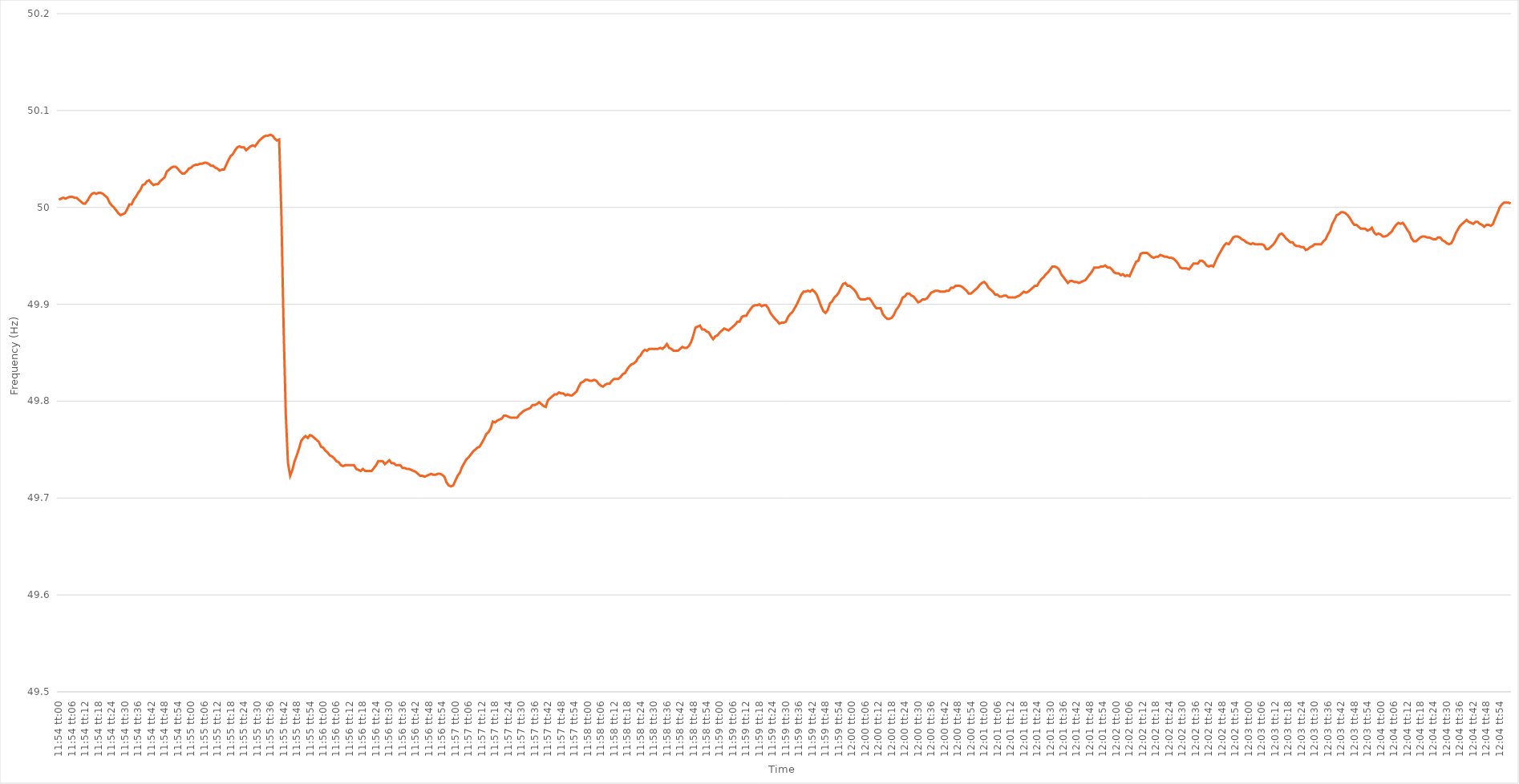
| Category | Series 0 |
|---|---|
| 0.49583333333333335 | 50.008 |
| 0.4958449074074074 | 50.009 |
| 0.4958564814814815 | 50.01 |
| 0.4958680555555555 | 50.009 |
| 0.49587962962962967 | 50.01 |
| 0.4958912037037037 | 50.011 |
| 0.4959027777777778 | 50.011 |
| 0.49591435185185184 | 50.01 |
| 0.49592592592592594 | 50.01 |
| 0.4959375 | 50.008 |
| 0.4959490740740741 | 50.006 |
| 0.49596064814814816 | 50.004 |
| 0.49597222222222226 | 50.004 |
| 0.4959837962962963 | 50.007 |
| 0.49599537037037034 | 50.011 |
| 0.49600694444444443 | 50.014 |
| 0.49601851851851847 | 50.015 |
| 0.4960300925925926 | 50.014 |
| 0.49604166666666666 | 50.015 |
| 0.49605324074074075 | 50.015 |
| 0.4960648148148148 | 50.014 |
| 0.4960763888888889 | 50.012 |
| 0.4960879629629629 | 50.01 |
| 0.4960995370370371 | 50.005 |
| 0.4961111111111111 | 50.002 |
| 0.4961226851851852 | 50 |
| 0.49613425925925925 | 49.997 |
| 0.49614583333333334 | 49.994 |
| 0.4961574074074074 | 49.992 |
| 0.49616898148148153 | 49.993 |
| 0.49618055555555557 | 49.994 |
| 0.49619212962962966 | 49.998 |
| 0.4962037037037037 | 50.003 |
| 0.49621527777777774 | 50.003 |
| 0.49622685185185184 | 50.008 |
| 0.4962384259259259 | 50.011 |
| 0.49625 | 50.015 |
| 0.49626157407407406 | 50.018 |
| 0.49627314814814816 | 50.023 |
| 0.4962847222222222 | 50.024 |
| 0.4962962962962963 | 50.027 |
| 0.49630787037037033 | 50.028 |
| 0.4963194444444445 | 50.025 |
| 0.4963310185185185 | 50.023 |
| 0.4963425925925926 | 50.024 |
| 0.49635416666666665 | 50.024 |
| 0.49636574074074075 | 50.027 |
| 0.4963773148148148 | 50.029 |
| 0.49638888888888894 | 50.031 |
| 0.496400462962963 | 50.037 |
| 0.49641203703703707 | 50.039 |
| 0.4964236111111111 | 50.041 |
| 0.4964351851851852 | 50.042 |
| 0.49644675925925924 | 50.042 |
| 0.4964583333333333 | 50.04 |
| 0.49646990740740743 | 50.037 |
| 0.49648148148148147 | 50.035 |
| 0.49649305555555556 | 50.035 |
| 0.4965046296296296 | 50.037 |
| 0.4965162037037037 | 50.04 |
| 0.49652777777777773 | 50.041 |
| 0.4965393518518519 | 50.043 |
| 0.4965509259259259 | 50.044 |
| 0.4965625 | 50.044 |
| 0.49657407407407406 | 50.045 |
| 0.49658564814814815 | 50.045 |
| 0.4965972222222222 | 50.046 |
| 0.49660879629629634 | 50.046 |
| 0.4966203703703704 | 50.045 |
| 0.4966319444444445 | 50.043 |
| 0.4966435185185185 | 50.043 |
| 0.4966550925925926 | 50.041 |
| 0.49666666666666665 | 50.04 |
| 0.4966782407407408 | 50.038 |
| 0.49668981481481483 | 50.039 |
| 0.4967013888888889 | 50.039 |
| 0.49671296296296297 | 50.044 |
| 0.496724537037037 | 50.049 |
| 0.4967361111111111 | 50.053 |
| 0.49674768518518514 | 50.055 |
| 0.4967592592592593 | 50.059 |
| 0.49677083333333333 | 50.062 |
| 0.4967824074074074 | 50.063 |
| 0.49679398148148146 | 50.062 |
| 0.49680555555555556 | 50.062 |
| 0.4968171296296296 | 50.059 |
| 0.49682870370370374 | 50.061 |
| 0.4968402777777778 | 50.063 |
| 0.4968518518518519 | 50.064 |
| 0.4968634259259259 | 50.063 |
| 0.496875 | 50.066 |
| 0.49688657407407405 | 50.069 |
| 0.4968981481481482 | 50.071 |
| 0.49690972222222224 | 50.073 |
| 0.49692129629629633 | 50.074 |
| 0.49693287037037037 | 50.074 |
| 0.4969444444444444 | 50.075 |
| 0.4969560185185185 | 50.074 |
| 0.49696759259259254 | 50.071 |
| 0.4969791666666667 | 50.069 |
| 0.49699074074074073 | 50.07 |
| 0.4970023148148148 | 49.994 |
| 0.49701388888888887 | 49.878 |
| 0.49702546296296296 | 49.787 |
| 0.497037037037037 | 49.736 |
| 0.49704861111111115 | 49.723 |
| 0.4970601851851852 | 49.729 |
| 0.4970717592592593 | 49.738 |
| 0.4970833333333333 | 49.744 |
| 0.4970949074074074 | 49.751 |
| 0.49710648148148145 | 49.759 |
| 0.4971180555555556 | 49.762 |
| 0.49712962962962964 | 49.764 |
| 0.49714120370370374 | 49.762 |
| 0.4971527777777778 | 49.765 |
| 0.4971643518518518 | 49.764 |
| 0.4971759259259259 | 49.762 |
| 0.49718749999999995 | 49.76 |
| 0.4971990740740741 | 49.758 |
| 0.49721064814814814 | 49.753 |
| 0.49722222222222223 | 49.752 |
| 0.49723379629629627 | 49.749 |
| 0.49724537037037037 | 49.747 |
| 0.4972569444444444 | 49.744 |
| 0.49726851851851855 | 49.743 |
| 0.4972800925925926 | 49.741 |
| 0.4972916666666667 | 49.738 |
| 0.4973032407407407 | 49.737 |
| 0.4973148148148148 | 49.734 |
| 0.49732638888888886 | 49.733 |
| 0.497337962962963 | 49.734 |
| 0.49734953703703705 | 49.734 |
| 0.49736111111111114 | 49.734 |
| 0.4973726851851852 | 49.734 |
| 0.4973842592592593 | 49.734 |
| 0.4973958333333333 | 49.73 |
| 0.49740740740740735 | 49.729 |
| 0.4974189814814815 | 49.728 |
| 0.49743055555555554 | 49.73 |
| 0.49744212962962964 | 49.728 |
| 0.4974537037037037 | 49.728 |
| 0.49746527777777777 | 49.728 |
| 0.4974768518518518 | 49.728 |
| 0.49748842592592596 | 49.731 |
| 0.4975 | 49.734 |
| 0.4975115740740741 | 49.738 |
| 0.49752314814814813 | 49.738 |
| 0.4975347222222222 | 49.738 |
| 0.49754629629629626 | 49.735 |
| 0.4975578703703704 | 49.737 |
| 0.49756944444444445 | 49.739 |
| 0.49758101851851855 | 49.736 |
| 0.4975925925925926 | 49.736 |
| 0.4976041666666667 | 49.734 |
| 0.4976157407407407 | 49.734 |
| 0.49762731481481487 | 49.734 |
| 0.4976388888888889 | 49.731 |
| 0.49765046296296295 | 49.731 |
| 0.49766203703703704 | 49.73 |
| 0.4976736111111111 | 49.73 |
| 0.4976851851851852 | 49.729 |
| 0.4976967592592592 | 49.728 |
| 0.49770833333333336 | 49.727 |
| 0.4977199074074074 | 49.725 |
| 0.4977314814814815 | 49.723 |
| 0.49774305555555554 | 49.723 |
| 0.49775462962962963 | 49.722 |
| 0.49776620370370367 | 49.723 |
| 0.4977777777777778 | 49.724 |
| 0.49778935185185186 | 49.725 |
| 0.49780092592592595 | 49.724 |
| 0.4978125 | 49.724 |
| 0.4978240740740741 | 49.725 |
| 0.4978356481481481 | 49.725 |
| 0.4978472222222223 | 49.724 |
| 0.4978587962962963 | 49.722 |
| 0.49787037037037035 | 49.716 |
| 0.49788194444444445 | 49.713 |
| 0.4978935185185185 | 49.712 |
| 0.4979050925925926 | 49.713 |
| 0.4979166666666666 | 49.718 |
| 0.49792824074074077 | 49.723 |
| 0.4979398148148148 | 49.726 |
| 0.4979513888888889 | 49.732 |
| 0.49796296296296294 | 49.736 |
| 0.49797453703703703 | 49.74 |
| 0.4979861111111111 | 49.742 |
| 0.4979976851851852 | 49.745 |
| 0.49800925925925926 | 49.748 |
| 0.49802083333333336 | 49.75 |
| 0.4980324074074074 | 49.752 |
| 0.4980439814814815 | 49.753 |
| 0.49805555555555553 | 49.757 |
| 0.4980671296296297 | 49.761 |
| 0.4980787037037037 | 49.766 |
| 0.4980902777777778 | 49.768 |
| 0.49810185185185185 | 49.772 |
| 0.4981134259259259 | 49.779 |
| 0.498125 | 49.778 |
| 0.498136574074074 | 49.78 |
| 0.4981481481481482 | 49.781 |
| 0.4981597222222222 | 49.782 |
| 0.4981712962962963 | 49.785 |
| 0.49818287037037035 | 49.785 |
| 0.49819444444444444 | 49.784 |
| 0.4982060185185185 | 49.783 |
| 0.49821759259259263 | 49.783 |
| 0.49822916666666667 | 49.783 |
| 0.49824074074074076 | 49.783 |
| 0.4982523148148148 | 49.786 |
| 0.4982638888888889 | 49.788 |
| 0.49827546296296293 | 49.79 |
| 0.4982870370370371 | 49.791 |
| 0.4982986111111111 | 49.792 |
| 0.4983101851851852 | 49.793 |
| 0.49832175925925926 | 49.796 |
| 0.49833333333333335 | 49.796 |
| 0.4983449074074074 | 49.797 |
| 0.49835648148148143 | 49.799 |
| 0.4983680555555556 | 49.797 |
| 0.4983796296296296 | 49.795 |
| 0.4983912037037037 | 49.794 |
| 0.49840277777777775 | 49.801 |
| 0.49841435185185184 | 49.803 |
| 0.4984259259259259 | 49.805 |
| 0.49843750000000003 | 49.807 |
| 0.49844907407407407 | 49.807 |
| 0.49846064814814817 | 49.809 |
| 0.4984722222222222 | 49.808 |
| 0.4984837962962963 | 49.808 |
| 0.49849537037037034 | 49.806 |
| 0.4985069444444445 | 49.807 |
| 0.4985185185185185 | 49.806 |
| 0.4985300925925926 | 49.806 |
| 0.49854166666666666 | 49.808 |
| 0.49855324074074076 | 49.81 |
| 0.4985648148148148 | 49.815 |
| 0.49857638888888894 | 49.819 |
| 0.498587962962963 | 49.82 |
| 0.498599537037037 | 49.822 |
| 0.4986111111111111 | 49.822 |
| 0.49862268518518515 | 49.821 |
| 0.49863425925925925 | 49.821 |
| 0.4986458333333333 | 49.822 |
| 0.49865740740740744 | 49.821 |
| 0.4986689814814815 | 49.818 |
| 0.49868055555555557 | 49.816 |
| 0.4986921296296296 | 49.815 |
| 0.4987037037037037 | 49.817 |
| 0.49871527777777774 | 49.818 |
| 0.4987268518518519 | 49.818 |
| 0.49873842592592593 | 49.821 |
| 0.49875 | 49.823 |
| 0.49876157407407407 | 49.823 |
| 0.49877314814814816 | 49.823 |
| 0.4987847222222222 | 49.825 |
| 0.49879629629629635 | 49.828 |
| 0.4988078703703704 | 49.829 |
| 0.4988194444444444 | 49.833 |
| 0.4988310185185185 | 49.836 |
| 0.49884259259259256 | 49.838 |
| 0.49885416666666665 | 49.839 |
| 0.4988657407407407 | 49.841 |
| 0.49887731481481484 | 49.845 |
| 0.4988888888888889 | 49.847 |
| 0.498900462962963 | 49.851 |
| 0.498912037037037 | 49.853 |
| 0.4989236111111111 | 49.852 |
| 0.49893518518518515 | 49.854 |
| 0.4989467592592593 | 49.854 |
| 0.49895833333333334 | 49.854 |
| 0.49896990740740743 | 49.854 |
| 0.49898148148148147 | 49.854 |
| 0.49899305555555556 | 49.855 |
| 0.4990046296296296 | 49.854 |
| 0.49901620370370375 | 49.856 |
| 0.4990277777777778 | 49.859 |
| 0.4990393518518519 | 49.855 |
| 0.4990509259259259 | 49.854 |
| 0.49906249999999996 | 49.852 |
| 0.49907407407407406 | 49.852 |
| 0.4990856481481481 | 49.852 |
| 0.49909722222222225 | 49.854 |
| 0.4991087962962963 | 49.856 |
| 0.4991203703703704 | 49.855 |
| 0.4991319444444444 | 49.855 |
| 0.4991435185185185 | 49.857 |
| 0.49915509259259255 | 49.861 |
| 0.4991666666666667 | 49.868 |
| 0.49917824074074074 | 49.876 |
| 0.49918981481481484 | 49.877 |
| 0.4992013888888889 | 49.878 |
| 0.49921296296296297 | 49.874 |
| 0.499224537037037 | 49.874 |
| 0.49923611111111116 | 49.872 |
| 0.4992476851851852 | 49.871 |
| 0.4992592592592593 | 49.867 |
| 0.49927083333333333 | 49.864 |
| 0.4992824074074074 | 49.867 |
| 0.49929398148148146 | 49.868 |
| 0.4993055555555555 | 49.871 |
| 0.49931712962962965 | 49.873 |
| 0.4993287037037037 | 49.875 |
| 0.4993402777777778 | 49.874 |
| 0.4993518518518518 | 49.873 |
| 0.4993634259259259 | 49.875 |
| 0.49937499999999996 | 49.877 |
| 0.4993865740740741 | 49.879 |
| 0.49939814814814815 | 49.882 |
| 0.49940972222222224 | 49.882 |
| 0.4994212962962963 | 49.887 |
| 0.4994328703703704 | 49.888 |
| 0.4994444444444444 | 49.888 |
| 0.49945601851851856 | 49.892 |
| 0.4994675925925926 | 49.895 |
| 0.4994791666666667 | 49.898 |
| 0.49949074074074074 | 49.899 |
| 0.49950231481481483 | 49.899 |
| 0.49951388888888887 | 49.9 |
| 0.499525462962963 | 49.898 |
| 0.49953703703703706 | 49.899 |
| 0.4995486111111111 | 49.899 |
| 0.4995601851851852 | 49.896 |
| 0.49957175925925923 | 49.891 |
| 0.4995833333333333 | 49.888 |
| 0.49959490740740736 | 49.885 |
| 0.4996064814814815 | 49.883 |
| 0.49961805555555555 | 49.88 |
| 0.49962962962962965 | 49.881 |
| 0.4996412037037037 | 49.881 |
| 0.4996527777777778 | 49.882 |
| 0.4996643518518518 | 49.887 |
| 0.49967592592592597 | 49.89 |
| 0.4996875 | 49.892 |
| 0.4996990740740741 | 49.896 |
| 0.49971064814814814 | 49.9 |
| 0.49972222222222223 | 49.905 |
| 0.4997337962962963 | 49.91 |
| 0.4997453703703704 | 49.913 |
| 0.49975694444444446 | 49.913 |
| 0.4997685185185185 | 49.914 |
| 0.4997800925925926 | 49.913 |
| 0.49979166666666663 | 49.915 |
| 0.49980324074074073 | 49.913 |
| 0.49981481481481477 | 49.91 |
| 0.4998263888888889 | 49.904 |
| 0.49983796296296296 | 49.898 |
| 0.49984953703703705 | 49.893 |
| 0.4998611111111111 | 49.891 |
| 0.4998726851851852 | 49.894 |
| 0.4998842592592592 | 49.901 |
| 0.4998958333333334 | 49.903 |
| 0.4999074074074074 | 49.907 |
| 0.4999189814814815 | 49.909 |
| 0.49993055555555554 | 49.912 |
| 0.49994212962962964 | 49.917 |
| 0.4999537037037037 | 49.921 |
| 0.49996527777777783 | 49.922 |
| 0.49997685185185187 | 49.919 |
| 0.49998842592592596 | 49.919 |
| 0.5 | 49.917 |
| 0.500011574074074 | 49.915 |
| 0.5000231481481482 | 49.912 |
| 0.5000347222222222 | 49.907 |
| 0.5000462962962963 | 49.905 |
| 0.5000578703703703 | 49.905 |
| 0.5000694444444445 | 49.905 |
| 0.5000810185185185 | 49.906 |
| 0.5000925925925926 | 49.906 |
| 0.5001041666666667 | 49.903 |
| 0.5001157407407407 | 49.899 |
| 0.5001273148148148 | 49.896 |
| 0.5001388888888889 | 49.896 |
| 0.500150462962963 | 49.896 |
| 0.5001620370370371 | 49.89 |
| 0.5001736111111111 | 49.887 |
| 0.5001851851851852 | 49.885 |
| 0.5001967592592592 | 49.885 |
| 0.5002083333333334 | 49.886 |
| 0.5002199074074074 | 49.889 |
| 0.5002314814814816 | 49.894 |
| 0.5002430555555556 | 49.897 |
| 0.5002546296296296 | 49.901 |
| 0.5002662037037037 | 49.907 |
| 0.5002777777777777 | 49.908 |
| 0.5002893518518519 | 49.911 |
| 0.5003009259259259 | 49.911 |
| 0.5003125 | 49.909 |
| 0.5003240740740741 | 49.908 |
| 0.5003356481481481 | 49.905 |
| 0.5003472222222222 | 49.902 |
| 0.5003587962962963 | 49.903 |
| 0.5003703703703704 | 49.905 |
| 0.5003819444444445 | 49.905 |
| 0.5003935185185185 | 49.906 |
| 0.5004050925925926 | 49.909 |
| 0.5004166666666666 | 49.912 |
| 0.5004282407407408 | 49.913 |
| 0.5004398148148148 | 49.914 |
| 0.500451388888889 | 49.914 |
| 0.500462962962963 | 49.913 |
| 0.500474537037037 | 49.913 |
| 0.5004861111111111 | 49.913 |
| 0.5004976851851851 | 49.914 |
| 0.5005092592592593 | 49.914 |
| 0.5005208333333333 | 49.917 |
| 0.5005324074074075 | 49.917 |
| 0.5005439814814815 | 49.919 |
| 0.5005555555555555 | 49.919 |
| 0.5005671296296296 | 49.919 |
| 0.5005787037037037 | 49.918 |
| 0.5005902777777778 | 49.916 |
| 0.5006018518518519 | 49.914 |
| 0.500613425925926 | 49.911 |
| 0.500625 | 49.911 |
| 0.500636574074074 | 49.913 |
| 0.5006481481481482 | 49.915 |
| 0.5006597222222222 | 49.917 |
| 0.5006712962962964 | 49.92 |
| 0.5006828703703704 | 49.922 |
| 0.5006944444444444 | 49.923 |
| 0.5007060185185185 | 49.921 |
| 0.5007175925925925 | 49.917 |
| 0.5007291666666667 | 49.915 |
| 0.5007407407407407 | 49.913 |
| 0.5007523148148149 | 49.91 |
| 0.5007638888888889 | 49.91 |
| 0.5007754629629629 | 49.908 |
| 0.500787037037037 | 49.908 |
| 0.5007986111111111 | 49.909 |
| 0.5008101851851852 | 49.909 |
| 0.5008217592592593 | 49.907 |
| 0.5008333333333334 | 49.907 |
| 0.5008449074074074 | 49.907 |
| 0.5008564814814814 | 49.907 |
| 0.5008680555555556 | 49.908 |
| 0.5008796296296296 | 49.909 |
| 0.5008912037037038 | 49.911 |
| 0.5009027777777778 | 49.913 |
| 0.5009143518518518 | 49.912 |
| 0.5009259259259259 | 49.913 |
| 0.5009375 | 49.915 |
| 0.5009490740740741 | 49.917 |
| 0.5009606481481481 | 49.919 |
| 0.5009722222222223 | 49.919 |
| 0.5009837962962963 | 49.923 |
| 0.5009953703703703 | 49.926 |
| 0.5010069444444444 | 49.928 |
| 0.5010185185185185 | 49.931 |
| 0.5010300925925926 | 49.933 |
| 0.5010416666666667 | 49.936 |
| 0.5010532407407408 | 49.939 |
| 0.5010648148148148 | 49.939 |
| 0.5010763888888888 | 49.938 |
| 0.501087962962963 | 49.936 |
| 0.501099537037037 | 49.931 |
| 0.5011111111111112 | 49.928 |
| 0.5011226851851852 | 49.925 |
| 0.5011342592592593 | 49.922 |
| 0.5011458333333333 | 49.924 |
| 0.5011574074074074 | 49.924 |
| 0.5011689814814815 | 49.923 |
| 0.5011805555555556 | 49.923 |
| 0.5011921296296297 | 49.922 |
| 0.5012037037037037 | 49.923 |
| 0.5012152777777777 | 49.924 |
| 0.5012268518518518 | 49.925 |
| 0.5012384259259259 | 49.928 |
| 0.50125 | 49.931 |
| 0.5012615740740741 | 49.934 |
| 0.5012731481481482 | 49.938 |
| 0.5012847222222222 | 49.938 |
| 0.5012962962962962 | 49.938 |
| 0.5013078703703704 | 49.939 |
| 0.5013194444444444 | 49.939 |
| 0.5013310185185186 | 49.94 |
| 0.5013425925925926 | 49.938 |
| 0.5013541666666667 | 49.938 |
| 0.5013657407407407 | 49.936 |
| 0.5013773148148148 | 49.933 |
| 0.5013888888888889 | 49.932 |
| 0.501400462962963 | 49.932 |
| 0.5014120370370371 | 49.93 |
| 0.5014236111111111 | 49.931 |
| 0.5014351851851852 | 49.929 |
| 0.5014467592592592 | 49.93 |
| 0.5014583333333333 | 49.929 |
| 0.5014699074074074 | 49.934 |
| 0.5014814814814815 | 49.939 |
| 0.5014930555555556 | 49.944 |
| 0.5015046296296296 | 49.945 |
| 0.5015162037037036 | 49.952 |
| 0.5015277777777778 | 49.953 |
| 0.5015393518518518 | 49.953 |
| 0.501550925925926 | 49.953 |
| 0.5015625 | 49.951 |
| 0.5015740740740741 | 49.949 |
| 0.5015856481481481 | 49.948 |
| 0.5015972222222222 | 49.949 |
| 0.5016087962962963 | 49.949 |
| 0.5016203703703704 | 49.951 |
| 0.5016319444444445 | 49.95 |
| 0.5016435185185185 | 49.949 |
| 0.5016550925925926 | 49.949 |
| 0.5016666666666666 | 49.948 |
| 0.5016782407407407 | 49.948 |
| 0.5016898148148148 | 49.947 |
| 0.5017013888888889 | 49.945 |
| 0.501712962962963 | 49.942 |
| 0.501724537037037 | 49.938 |
| 0.501736111111111 | 49.937 |
| 0.5017476851851852 | 49.937 |
| 0.5017592592592592 | 49.937 |
| 0.5017708333333334 | 49.936 |
| 0.5017824074074074 | 49.939 |
| 0.5017939814814815 | 49.942 |
| 0.5018055555555555 | 49.942 |
| 0.5018171296296297 | 49.942 |
| 0.5018287037037037 | 49.945 |
| 0.5018402777777778 | 49.945 |
| 0.5018518518518519 | 49.943 |
| 0.5018634259259259 | 49.94 |
| 0.501875 | 49.939 |
| 0.5018865740740741 | 49.94 |
| 0.5018981481481481 | 49.939 |
| 0.5019097222222222 | 49.944 |
| 0.5019212962962963 | 49.949 |
| 0.5019328703703704 | 49.953 |
| 0.5019444444444444 | 49.957 |
| 0.5019560185185185 | 49.961 |
| 0.5019675925925926 | 49.963 |
| 0.5019791666666666 | 49.962 |
| 0.5019907407407408 | 49.965 |
| 0.5020023148148148 | 49.969 |
| 0.5020138888888889 | 49.97 |
| 0.5020254629629629 | 49.97 |
| 0.5020370370370371 | 49.969 |
| 0.5020486111111111 | 49.967 |
| 0.5020601851851852 | 49.966 |
| 0.5020717592592593 | 49.964 |
| 0.5020833333333333 | 49.963 |
| 0.5020949074074074 | 49.962 |
| 0.5021064814814815 | 49.963 |
| 0.5021180555555556 | 49.962 |
| 0.5021296296296297 | 49.962 |
| 0.5021412037037037 | 49.962 |
| 0.5021527777777778 | 49.962 |
| 0.5021643518518518 | 49.961 |
| 0.5021759259259259 | 49.957 |
| 0.5021875 | 49.957 |
| 0.502199074074074 | 49.959 |
| 0.5022106481481482 | 49.961 |
| 0.5022222222222222 | 49.964 |
| 0.5022337962962963 | 49.968 |
| 0.5022453703703703 | 49.972 |
| 0.5022569444444445 | 49.973 |
| 0.5022685185185185 | 49.971 |
| 0.5022800925925927 | 49.968 |
| 0.5022916666666667 | 49.966 |
| 0.5023032407407407 | 49.964 |
| 0.5023148148148148 | 49.964 |
| 0.5023263888888889 | 49.961 |
| 0.502337962962963 | 49.96 |
| 0.5023495370370371 | 49.96 |
| 0.5023611111111111 | 49.959 |
| 0.5023726851851852 | 49.959 |
| 0.5023842592592592 | 49.956 |
| 0.5023958333333333 | 49.957 |
| 0.5024074074074074 | 49.959 |
| 0.5024189814814815 | 49.96 |
| 0.5024305555555556 | 49.962 |
| 0.5024421296296296 | 49.962 |
| 0.5024537037037037 | 49.962 |
| 0.5024652777777777 | 49.962 |
| 0.5024768518518519 | 49.965 |
| 0.5024884259259259 | 49.967 |
| 0.5025000000000001 | 49.972 |
| 0.5025115740740741 | 49.976 |
| 0.5025231481481481 | 49.983 |
| 0.5025347222222222 | 49.987 |
| 0.5025462962962963 | 49.992 |
| 0.5025578703703704 | 49.993 |
| 0.5025694444444445 | 49.995 |
| 0.5025810185185186 | 49.995 |
| 0.5025925925925926 | 49.994 |
| 0.5026041666666666 | 49.992 |
| 0.5026157407407407 | 49.989 |
| 0.5026273148148148 | 49.985 |
| 0.5026388888888889 | 49.982 |
| 0.502650462962963 | 49.982 |
| 0.502662037037037 | 49.98 |
| 0.5026736111111111 | 49.978 |
| 0.5026851851851851 | 49.978 |
| 0.5026967592592593 | 49.978 |
| 0.5027083333333333 | 49.976 |
| 0.5027199074074075 | 49.977 |
| 0.5027314814814815 | 49.979 |
| 0.5027430555555555 | 49.974 |
| 0.5027546296296296 | 49.972 |
| 0.5027662037037037 | 49.973 |
| 0.5027777777777778 | 49.972 |
| 0.5027893518518519 | 49.97 |
| 0.502800925925926 | 49.97 |
| 0.5028125 | 49.971 |
| 0.502824074074074 | 49.973 |
| 0.5028356481481482 | 49.975 |
| 0.5028472222222222 | 49.979 |
| 0.5028587962962963 | 49.982 |
| 0.5028703703703704 | 49.984 |
| 0.5028819444444445 | 49.983 |
| 0.5028935185185185 | 49.984 |
| 0.5029050925925925 | 49.981 |
| 0.5029166666666667 | 49.977 |
| 0.5029282407407407 | 49.974 |
| 0.5029398148148149 | 49.968 |
| 0.5029513888888889 | 49.965 |
| 0.502962962962963 | 49.965 |
| 0.502974537037037 | 49.967 |
| 0.5029861111111111 | 49.969 |
| 0.5029976851851852 | 49.97 |
| 0.5030092592592593 | 49.97 |
| 0.5030208333333334 | 49.969 |
| 0.5030324074074074 | 49.969 |
| 0.5030439814814814 | 49.968 |
| 0.5030555555555556 | 49.967 |
| 0.5030671296296296 | 49.967 |
| 0.5030787037037037 | 49.969 |
| 0.5030902777777778 | 49.969 |
| 0.5031018518518519 | 49.966 |
| 0.5031134259259259 | 49.965 |
| 0.5031249999999999 | 49.963 |
| 0.5031365740740741 | 49.962 |
| 0.5031481481481481 | 49.963 |
| 0.5031597222222223 | 49.967 |
| 0.5031712962962963 | 49.973 |
| 0.5031828703703703 | 49.977 |
| 0.5031944444444444 | 49.981 |
| 0.5032060185185185 | 49.983 |
| 0.5032175925925926 | 49.985 |
| 0.5032291666666667 | 49.987 |
| 0.5032407407407408 | 49.985 |
| 0.5032523148148148 | 49.984 |
| 0.5032638888888888 | 49.983 |
| 0.503275462962963 | 49.985 |
| 0.503287037037037 | 49.985 |
| 0.5032986111111112 | 49.983 |
| 0.5033101851851852 | 49.982 |
| 0.5033217592592593 | 49.98 |
| 0.5033333333333333 | 49.982 |
| 0.5033449074074073 | 49.982 |
| 0.5033564814814815 | 49.981 |
| 0.5033680555555555 | 49.983 |
| 0.5033796296296297 | 49.989 |
| 0.5033912037037037 | 49.994 |
| 0.5034027777777778 | 50 |
| 0.5034143518518518 | 50.003 |
| 0.5034259259259259 | 50.005 |
| 0.5034375 | 50.005 |
| 0.5034490740740741 | 50.005 |
| 0.5034606481481482 | 50.004 |